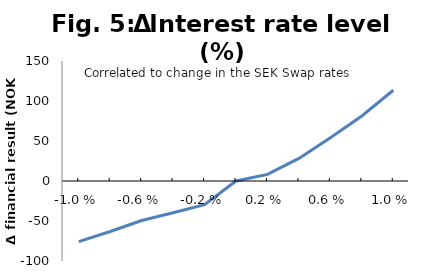
| Category | Series 0 |
|---|---|
| -0.01 | -75.86 |
| -0.008 | -63.158 |
| -0.006 | -49.352 |
| -0.004 | -39.779 |
| -0.002 | -29.613 |
| 0.0 | 0 |
| 0.002 | 8.216 |
| 0.004 | 28.261 |
| 0.006 | 54.14 |
| 0.008 | 81.262 |
| 0.01 | 113.465 |